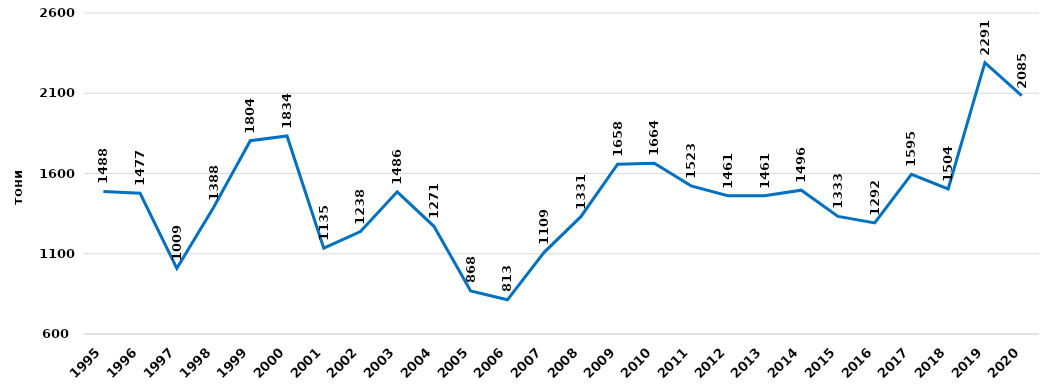
| Category | Вкупен улов на риба |
|---|---|
| 1995.0 | 1488 |
| 1996.0 | 1477 |
| 1997.0 | 1009 |
| 1998.0 | 1388 |
| 1999.0 | 1804 |
| 2000.0 | 1834 |
| 2001.0 | 1135 |
| 2002.0 | 1238 |
| 2003.0 | 1486 |
| 2004.0 | 1271 |
| 2005.0 | 868 |
| 2006.0 | 813 |
| 2007.0 | 1109 |
| 2008.0 | 1331 |
| 2009.0 | 1658 |
| 2010.0 | 1664 |
| 2011.0 | 1523 |
| 2012.0 | 1461 |
| 2013.0 | 1461 |
| 2014.0 | 1496 |
| 2015.0 | 1333 |
| 2016.0 | 1292 |
| 2017.0 | 1595 |
| 2018.0 | 1504 |
| 2019.0 | 2291 |
| 2020.0 | 2085 |